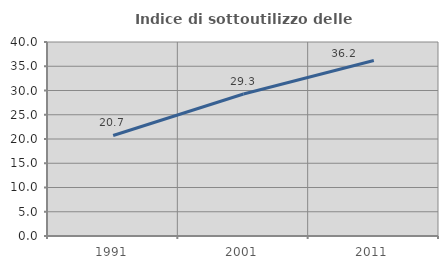
| Category | Indice di sottoutilizzo delle abitazioni  |
|---|---|
| 1991.0 | 20.724 |
| 2001.0 | 29.285 |
| 2011.0 | 36.187 |